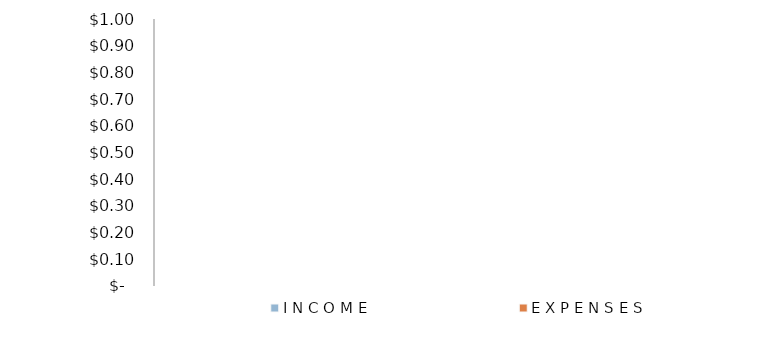
| Category | I N C O M E | E X P E N S E S |
|---|---|---|
| 0 | 0 | 0 |